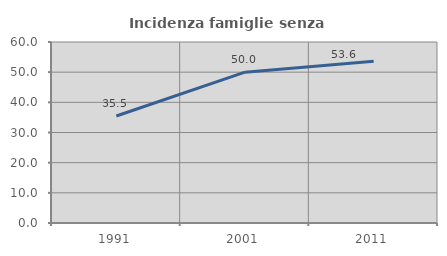
| Category | Incidenza famiglie senza nuclei |
|---|---|
| 1991.0 | 35.484 |
| 2001.0 | 50 |
| 2011.0 | 53.623 |